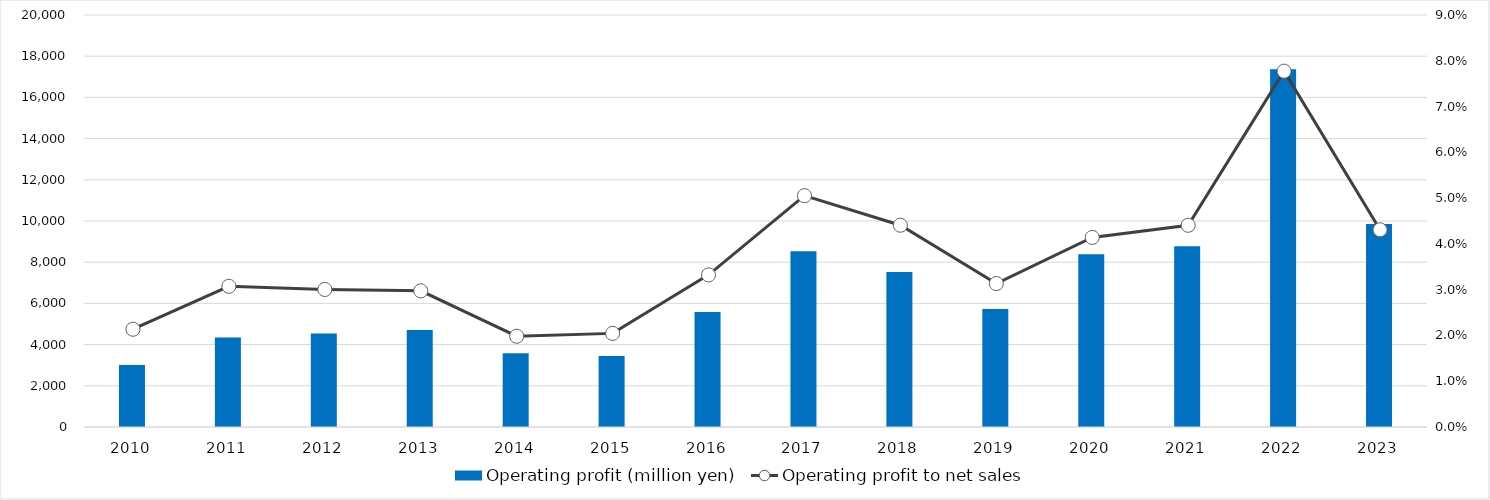
| Category | Operating profit (million yen) |
|---|---|
| 2010 | 3010 |
| 2011 | 4349 |
| 2012 | 4542 |
| 2013 | 4703 |
| 2014 | 3577 |
| 2015 | 3452 |
| 2016 | 5586 |
| 2017 | 8532 |
| 2018 | 7519 |
| 2019 | 5733 |
| 2020 | 8384 |
| 2021 | 8779 |
| 2022 | 17361 |
| 2023 | 9856 |